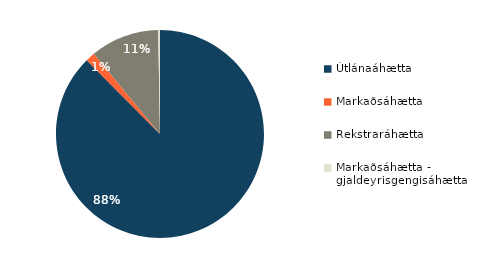
| Category | Series 0 |
|---|---|
| Útlánaáhætta | 0.876 |
| Markaðsáhætta | 0.015 |
| Rekstraráhætta | 0.107 |
| Markaðsáhætta - gjaldeyrisgengisáhætta | 0.003 |